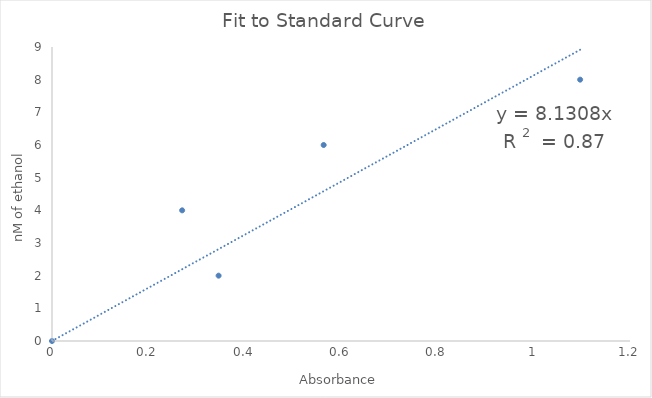
| Category | Series 0 |
|---|---|
| 0.0 | 0 |
| 0.3459 | 2 |
| 0.2702 | 4 |
| 0.564 | 6 |
| 1.0965 | 8 |